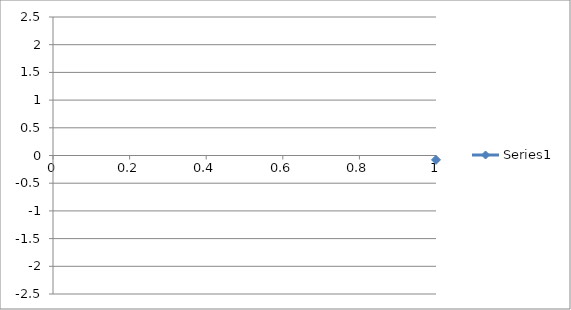
| Category | Series 0 |
|---|---|
| 0 | -0.078 |
| 1 | -0.084 |
| 2 | -0.099 |
| 3 | -0.094 |
| 4 | -0.1 |
| 5 | -0.1 |
| 6 | -0.103 |
| 7 | -0.105 |
| 8 | -0.11 |
| 9 | -0.111 |
| 10 | -0.121 |
| 11 | -0.123 |
| 12 | -0.118 |
| 13 | -0.116 |
| 14 | -0.125 |
| 15 | -0.135 |
| 16 | -0.131 |
| 17 | -0.161 |
| 18 | -0.159 |
| 19 | -0.169 |
| 20 | -0.193 |
| 21 | -0.203 |
| 22 | -0.229 |
| 23 | -0.241 |
| 24 | -0.248 |
| 25 | -0.277 |
| 26 | -0.304 |
| 27 | -0.339 |
| 28 | -0.352 |
| 29 | -0.364 |
| 30 | -0.375 |
| 31 | -0.376 |
| 32 | -0.361 |
| 33 | -0.369 |
| 34 | -0.372 |
| 35 | -0.357 |
| 36 | -0.355 |
| 37 | -0.335 |
| 38 | -0.325 |
| 39 | -0.302 |
| 40 | -0.282 |
| 41 | -0.25 |
| 42 | -0.193 |
| 43 | -0.141 |
| 44 | -0.07 |
| 45 | 0.004 |
| 46 | 0.078 |
| 47 | 0.155 |
| 48 | 0.26 |
| 49 | 0.357 |
| 50 | 0.466 |
| 51 | 0.601 |
| 52 | 0.728 |
| 53 | 0.897 |
| 54 | 1.028 |
| 55 | 1.142 |
| 56 | 1.335 |
| 57 | 1.436 |
| 58 | 1.55 |
| 59 | 1.681 |
| 60 | 1.802 |
| 61 | 1.896 |
| 62 | 1.977 |
| 63 | 2.055 |
| 64 | 2.105 |
| 65 | 2.142 |
| 66 | 2.15 |
| 67 | 2.135 |
| 68 | 2.115 |
| 69 | 2.077 |
| 70 | 2.013 |
| 71 | 1.929 |
| 72 | 1.801 |
| 73 | 1.661 |
| 74 | 1.505 |
| 75 | 1.356 |
| 76 | 1.154 |
| 77 | 0.955 |
| 78 | 0.736 |
| 79 | 0.508 |
| 80 | 0.291 |
| 81 | 0.04 |
| 82 | -0.206 |
| 83 | -0.44 |
| 84 | -0.654 |
| 85 | -0.883 |
| 86 | -1.072 |
| 87 | -1.25 |
| 88 | -1.433 |
| 89 | -1.554 |
| 90 | -1.675 |
| 91 | -1.804 |
| 92 | -1.881 |
| 93 | -1.931 |
| 94 | -1.967 |
| 95 | -1.99 |
| 96 | -1.989 |
| 97 | -1.952 |
| 98 | -1.934 |
| 99 | -1.85 |
| 100 | -1.798 |
| 101 | -1.713 |
| 102 | -1.615 |
| 103 | -1.514 |
| 104 | -1.385 |
| 105 | -1.243 |
| 106 | -1.096 |
| 107 | -0.97 |
| 108 | -0.806 |
| 109 | -0.658 |
| 110 | -0.525 |
| 111 | -0.398 |
| 112 | -0.269 |
| 113 | -0.147 |
| 114 | -0.055 |
| 115 | 0.042 |
| 116 | 0.117 |
| 117 | 0.202 |
| 118 | 0.272 |
| 119 | 0.333 |
| 120 | 0.371 |
| 121 | 0.401 |
| 122 | 0.434 |
| 123 | 0.471 |
| 124 | 0.487 |
| 125 | 0.504 |
| 126 | 0.504 |
| 127 | 0.504 |
| 128 | 0.514 |
| 129 | 0.502 |
| 130 | 0.501 |
| 131 | 0.517 |
| 132 | 0.485 |
| 133 | 0.485 |
| 134 | 0.45 |
| 135 | 0.449 |
| 136 | 0.441 |
| 137 | 0.417 |
| 138 | 0.398 |
| 139 | 0.388 |
| 140 | 0.373 |
| 141 | 0.351 |
| 142 | 0.323 |
| 143 | 0.323 |
| 144 | 0.321 |
| 145 | 0.309 |
| 146 | 0.298 |
| 147 | 0.279 |
| 148 | 0.281 |
| 149 | 0.276 |
| 150 | 0.293 |
| 151 | 0.267 |
| 152 | 0.259 |
| 153 | 0.257 |
| 154 | 0.246 |
| 155 | 0.252 |
| 156 | 0.252 |
| 157 | 0.259 |
| 158 | 0.257 |
| 159 | 0.258 |
| 160 | 0.262 |